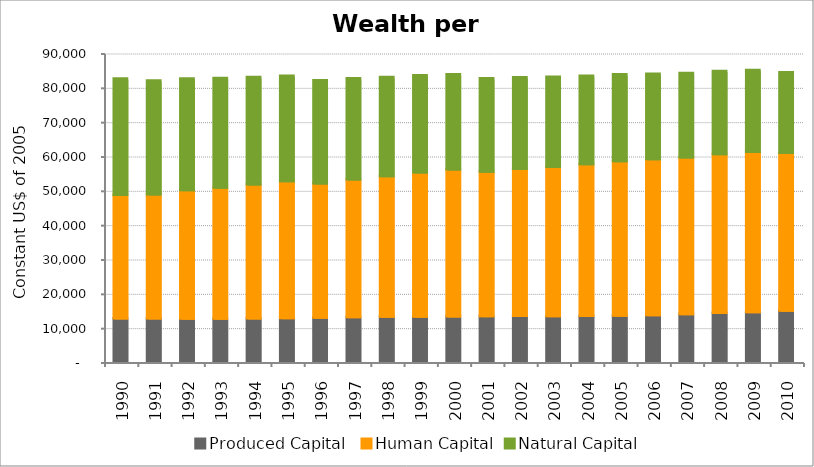
| Category | Produced Capital  | Human Capital | Natural Capital |
|---|---|---|---|
| 1990.0 | 12690.764 | 35985.765 | 33821.822 |
| 1991.0 | 12680.336 | 36074.519 | 33130.412 |
| 1992.0 | 12622.065 | 37420.715 | 32462.348 |
| 1993.0 | 12602.452 | 38182.201 | 31828.572 |
| 1994.0 | 12670.067 | 39041.105 | 31203.551 |
| 1995.0 | 12776.782 | 39887.859 | 30627.292 |
| 1996.0 | 12876.854 | 39115.488 | 30010.609 |
| 1997.0 | 13028.416 | 40109.183 | 29405.16 |
| 1998.0 | 13157.834 | 40950.677 | 28813.319 |
| 1999.0 | 13204.023 | 42001.591 | 28239.495 |
| 2000.0 | 13279.884 | 42794.692 | 27685.963 |
| 2001.0 | 13349.381 | 42038.751 | 27168.213 |
| 2002.0 | 13369.813 | 42810.027 | 26669.383 |
| 2003.0 | 13353.875 | 43462.387 | 26193.192 |
| 2004.0 | 13401.345 | 44173.66 | 25742.494 |
| 2005.0 | 13474.971 | 44991.461 | 25301.77 |
| 2006.0 | 13621.357 | 45396.38 | 24887.675 |
| 2007.0 | 13875.451 | 45694.427 | 24503.365 |
| 2008.0 | 14240.848 | 46265.196 | 24147.911 |
| 2009.0 | 14476.999 | 46719.804 | 23788.26 |
| 2010.0 | 14895.555 | 46002.985 | 23431.116 |